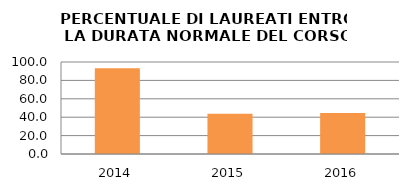
| Category | 2014 2015 2016 |
|---|---|
| 2014.0 | 93.333 |
| 2015.0 | 43.75 |
| 2016.0 | 44.444 |